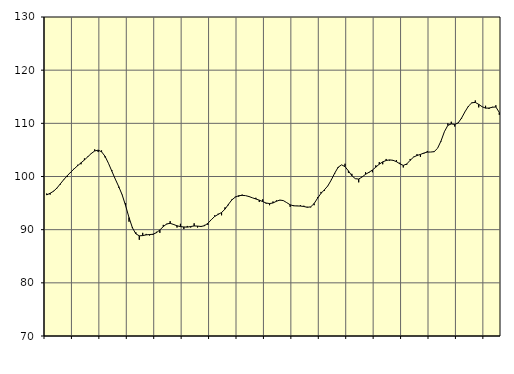
| Category | Piggar | Samtliga fast anställda (inkl. fast anställda utomlands) |
|---|---|---|
| nan | 96.8 | 96.53 |
| 87.0 | 96.6 | 96.85 |
| 87.0 | 97.3 | 97.23 |
| 87.0 | 97.8 | 97.84 |
| nan | 98.5 | 98.64 |
| 88.0 | 99.5 | 99.43 |
| 88.0 | 99.9 | 100.15 |
| 88.0 | 100.7 | 100.82 |
| nan | 101.5 | 101.44 |
| 89.0 | 102.2 | 102.02 |
| 89.0 | 102.3 | 102.57 |
| 89.0 | 103.4 | 103.11 |
| nan | 103.8 | 103.72 |
| 90.0 | 104.4 | 104.33 |
| 90.0 | 105.1 | 104.8 |
| 90.0 | 104.6 | 104.96 |
| nan | 104.9 | 104.65 |
| 91.0 | 103.6 | 103.81 |
| 91.0 | 102.5 | 102.5 |
| 91.0 | 101.2 | 101 |
| nan | 99.5 | 99.51 |
| 92.0 | 97.9 | 98.11 |
| 92.0 | 96.6 | 96.56 |
| 92.0 | 95 | 94.54 |
| nan | 91.5 | 92.28 |
| 93.0 | 90.5 | 90.35 |
| 93.0 | 89.5 | 89.22 |
| 93.0 | 88.1 | 88.84 |
| nan | 89.4 | 88.89 |
| 94.0 | 89.2 | 89.02 |
| 94.0 | 88.9 | 89.08 |
| 94.0 | 89 | 89.14 |
| nan | 89.6 | 89.43 |
| 95.0 | 89.4 | 89.95 |
| 95.0 | 90.9 | 90.58 |
| 95.0 | 91 | 91.08 |
| nan | 91.6 | 91.19 |
| 96.0 | 90.9 | 90.98 |
| 96.0 | 90.4 | 90.73 |
| 96.0 | 91.1 | 90.58 |
| nan | 90.1 | 90.51 |
| 97.0 | 90.7 | 90.48 |
| 97.0 | 90.4 | 90.59 |
| 97.0 | 91.2 | 90.7 |
| nan | 90.4 | 90.67 |
| 98.0 | 90.5 | 90.6 |
| 98.0 | 90.9 | 90.74 |
| 98.0 | 90.9 | 91.19 |
| nan | 91.9 | 91.87 |
| 99.0 | 92.7 | 92.49 |
| 99.0 | 93 | 92.87 |
| 99.0 | 92.7 | 93.23 |
| nan | 94.2 | 93.86 |
| 0.0 | 94.6 | 94.76 |
| 0.0 | 95.7 | 95.6 |
| 0.0 | 96.2 | 96.12 |
| nan | 96.2 | 96.39 |
| 1.0 | 96.6 | 96.45 |
| 1.0 | 96.4 | 96.4 |
| 1.0 | 96.2 | 96.23 |
| nan | 96 | 95.99 |
| 2.0 | 96 | 95.77 |
| 2.0 | 95.2 | 95.55 |
| 2.0 | 95.7 | 95.28 |
| nan | 94.9 | 95.01 |
| 3.0 | 94.6 | 94.91 |
| 3.0 | 95.3 | 95.02 |
| 3.0 | 95.5 | 95.34 |
| nan | 95.5 | 95.57 |
| 4.0 | 95.5 | 95.47 |
| 4.0 | 95.1 | 95.09 |
| 4.0 | 94.3 | 94.68 |
| nan | 94.6 | 94.49 |
| 5.0 | 94.5 | 94.46 |
| 5.0 | 94.6 | 94.44 |
| 5.0 | 94.5 | 94.36 |
| nan | 94.3 | 94.21 |
| 6.0 | 94.2 | 94.29 |
| 6.0 | 94.6 | 94.92 |
| 6.0 | 96.1 | 95.92 |
| nan | 97.1 | 96.83 |
| 7.0 | 97.3 | 97.5 |
| 7.0 | 98.2 | 98.24 |
| 7.0 | 99.4 | 99.35 |
| nan | 100.5 | 100.63 |
| 8.0 | 101.6 | 101.74 |
| 8.0 | 102.2 | 102.19 |
| 8.0 | 102.4 | 101.86 |
| nan | 100.7 | 101.05 |
| 9.0 | 100.5 | 100.15 |
| 9.0 | 99.6 | 99.59 |
| 9.0 | 98.9 | 99.52 |
| nan | 100 | 99.91 |
| 10.0 | 100.8 | 100.42 |
| 10.0 | 100.7 | 100.79 |
| 10.0 | 100.8 | 101.22 |
| nan | 102.1 | 101.76 |
| 11.0 | 102.7 | 102.32 |
| 11.0 | 102.3 | 102.75 |
| 11.0 | 103.3 | 103.01 |
| nan | 103 | 103.12 |
| 12.0 | 103 | 103.05 |
| 12.0 | 103.1 | 102.79 |
| 12.0 | 102.6 | 102.38 |
| nan | 101.7 | 102.09 |
| 13.0 | 102.2 | 102.35 |
| 13.0 | 103.3 | 103.04 |
| 13.0 | 103.7 | 103.65 |
| nan | 104.2 | 103.95 |
| 14.0 | 103.7 | 104.15 |
| 14.0 | 104.3 | 104.41 |
| 14.0 | 104.8 | 104.59 |
| nan | 104.6 | 104.6 |
| 15.0 | 104.6 | 104.67 |
| 15.0 | 105.3 | 105.31 |
| 15.0 | 106.6 | 106.68 |
| nan | 108.4 | 108.44 |
| 16.0 | 110 | 109.62 |
| 16.0 | 110.3 | 109.89 |
| 16.0 | 109.4 | 109.79 |
| nan | 110.1 | 110.07 |
| 17.0 | 110.9 | 111 |
| 17.0 | 112.2 | 112.18 |
| 17.0 | 113.1 | 113.23 |
| nan | 113.8 | 113.87 |
| 18.0 | 114.3 | 113.93 |
| 18.0 | 113 | 113.57 |
| 18.0 | 113.1 | 113.12 |
| nan | 113.3 | 112.86 |
| 19.0 | 112.7 | 112.87 |
| 19.0 | 113.1 | 113.03 |
| 19.0 | 113.4 | 113.08 |
| nan | 111.6 | 112.05 |